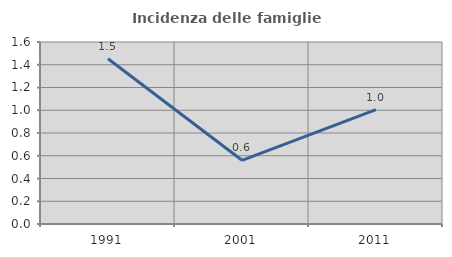
| Category | Incidenza delle famiglie numerose |
|---|---|
| 1991.0 | 1.453 |
| 2001.0 | 0.56 |
| 2011.0 | 1.006 |